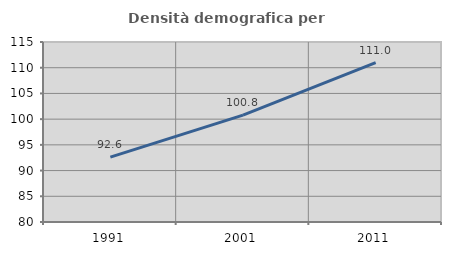
| Category | Densità demografica |
|---|---|
| 1991.0 | 92.613 |
| 2001.0 | 100.773 |
| 2011.0 | 110.973 |